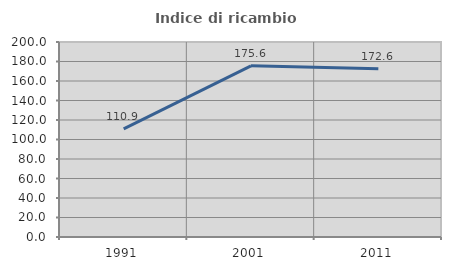
| Category | Indice di ricambio occupazionale  |
|---|---|
| 1991.0 | 110.87 |
| 2001.0 | 175.591 |
| 2011.0 | 172.571 |